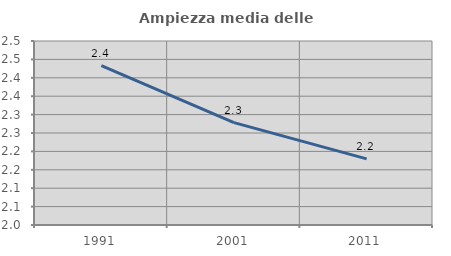
| Category | Ampiezza media delle famiglie |
|---|---|
| 1991.0 | 2.433 |
| 2001.0 | 2.278 |
| 2011.0 | 2.18 |